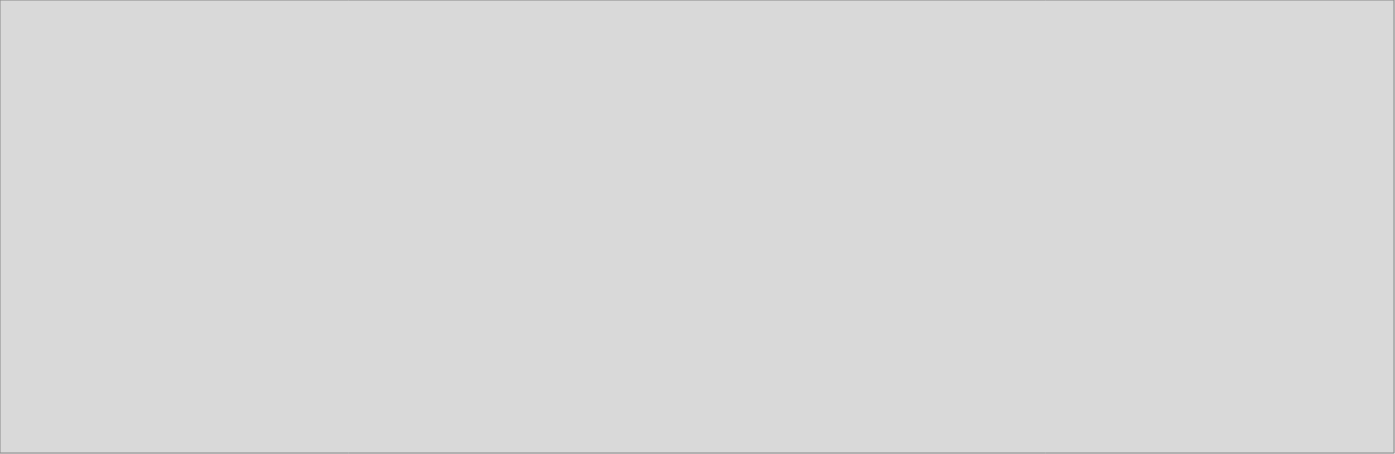
| Category | Suministro de Electricidad y captación de agua |
|---|---|
| 2018_I | 2843.695 |
| 2018_II | 3366.202 |
| 2018_III | 3418.747 |
| 2018_IV | 3615.623 |
| 2019_I | 2916.479 |
| 2019_II | 3628.235 |
| 2019_III | 0 |
| 2019_IV | 0 |